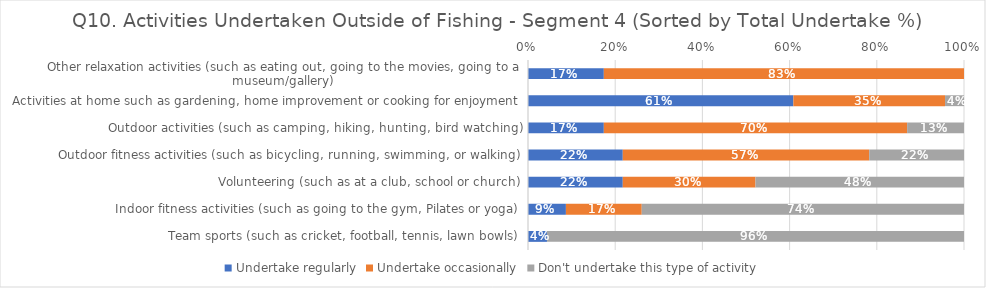
| Category | Undertake regularly | Undertake occasionally | Don't undertake this type of activity |
|---|---|---|---|
| Other relaxation activities (such as eating out, going to the movies, going to a museum/gallery) | 0.174 | 0.826 | 0 |
| Activities at home such as gardening, home improvement or cooking for enjoyment | 0.609 | 0.348 | 0.043 |
| Outdoor activities (such as camping, hiking, hunting, bird watching) | 0.174 | 0.696 | 0.13 |
| Outdoor fitness activities (such as bicycling, running, swimming, or walking) | 0.217 | 0.565 | 0.217 |
| Volunteering (such as at a club, school or church) | 0.217 | 0.304 | 0.478 |
| Indoor fitness activities (such as going to the gym, Pilates or yoga) | 0.087 | 0.174 | 0.739 |
| Team sports (such as cricket, football, tennis, lawn bowls) | 0.043 | 0 | 0.957 |